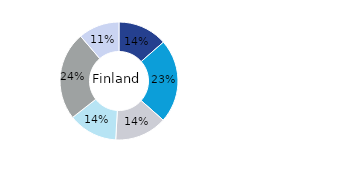
| Category | Finland |
|---|---|
| Office | 0.136 |
| Residential | 0.23 |
| Retail | 0.144 |
| Logistics* | 0.135 |
| Public Sector | 0.243 |
| Other | 0.113 |